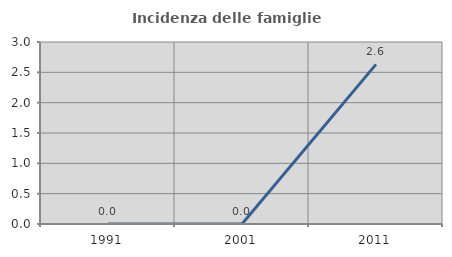
| Category | Incidenza delle famiglie numerose |
|---|---|
| 1991.0 | 0 |
| 2001.0 | 0 |
| 2011.0 | 2.632 |